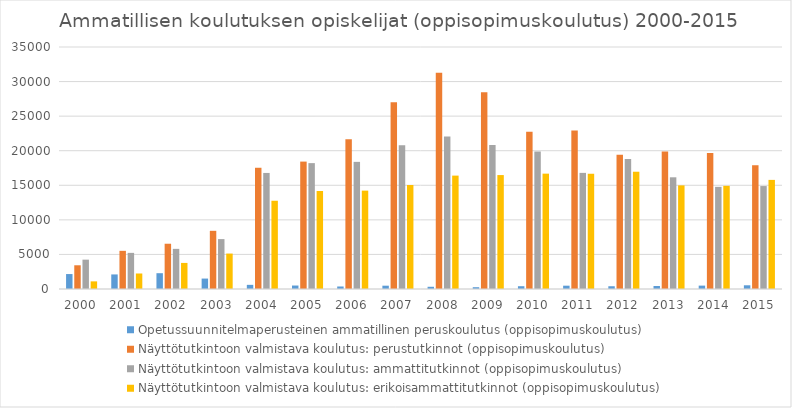
| Category | Opetussuunnitelmaperusteinen ammatillinen peruskoulutus (oppisopimuskoulutus) | Näyttötutkintoon valmistava koulutus: perustutkinnot (oppisopimuskoulutus) | Näyttötutkintoon valmistava koulutus: ammattitutkinnot (oppisopimuskoulutus) | Näyttötutkintoon valmistava koulutus: erikoisammattitutkinnot (oppisopimuskoulutus) |
|---|---|---|---|---|
| 2000 | 2162 | 3431 | 4244 | 1103 |
| 2001 | 2107 | 5520 | 5226 | 2243 |
| 2002 | 2285 | 6547 | 5806 | 3772 |
| 2003 | 1509 | 8415 | 7217 | 5124 |
| 2004 | 601 | 17535 | 16785 | 12764 |
| 2005 | 502 | 18427 | 18206 | 14172 |
| 2006 | 363 | 21654 | 18388 | 14227 |
| 2007 | 479 | 26996 | 20779 | 15041 |
| 2008 | 322 | 31274 | 22042 | 16399 |
| 2009 | 259 | 28450 | 20811 | 16477 |
| 2010 | 403 | 22741 | 19875 | 16683 |
| 2011 | 480 | 22934 | 16794 | 16668 |
| 2012 | 399 | 19407 | 18787 | 16961 |
| 2013 | 437 | 19885 | 16155 | 14989 |
| 2014 | 489 | 19672 | 14776 | 14919 |
| 2015 | 536 | 17899 | 14887 | 15780 |